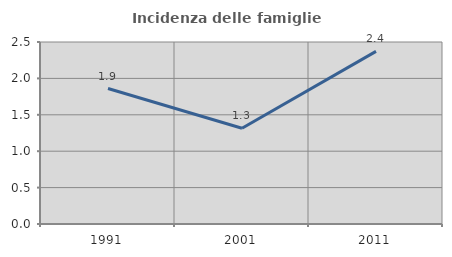
| Category | Incidenza delle famiglie numerose |
|---|---|
| 1991.0 | 1.861 |
| 2001.0 | 1.316 |
| 2011.0 | 2.372 |